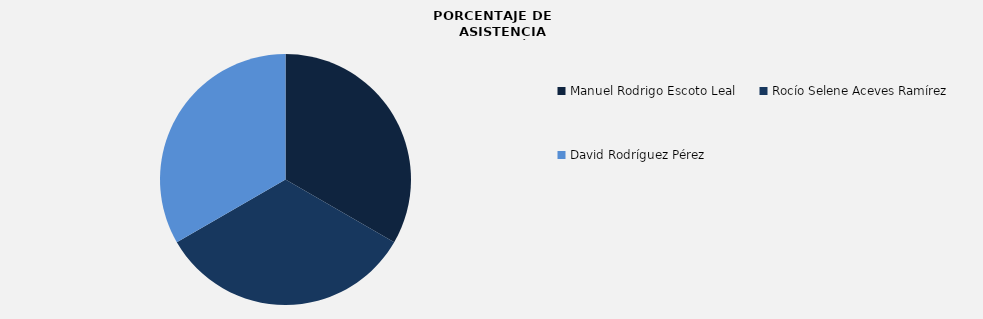
| Category | Series 0 |
|---|---|
| Manuel Rodrigo Escoto Leal | 100 |
| Rocío Selene Aceves Ramírez  | 100 |
| David Rodríguez Pérez | 100 |